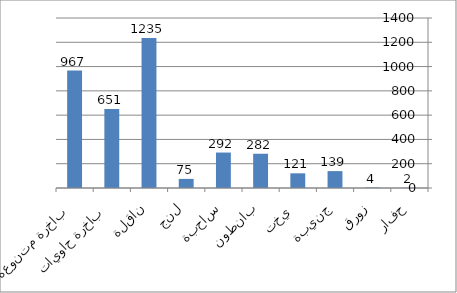
| Category | Series 0 |
|---|---|
| حفار | 2 |
| زورق | 4 |
| جنيبة | 139 |
| يخت  | 121 |
| بانطون | 282 |
| ساحبة | 292 |
| لنج | 75 |
| ناقلة | 1235 |
| باخرة حاويات  | 651 |
| باخرة متنوعة  | 967 |